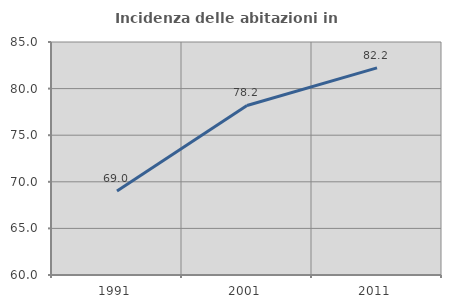
| Category | Incidenza delle abitazioni in proprietà  |
|---|---|
| 1991.0 | 69.005 |
| 2001.0 | 78.188 |
| 2011.0 | 82.222 |